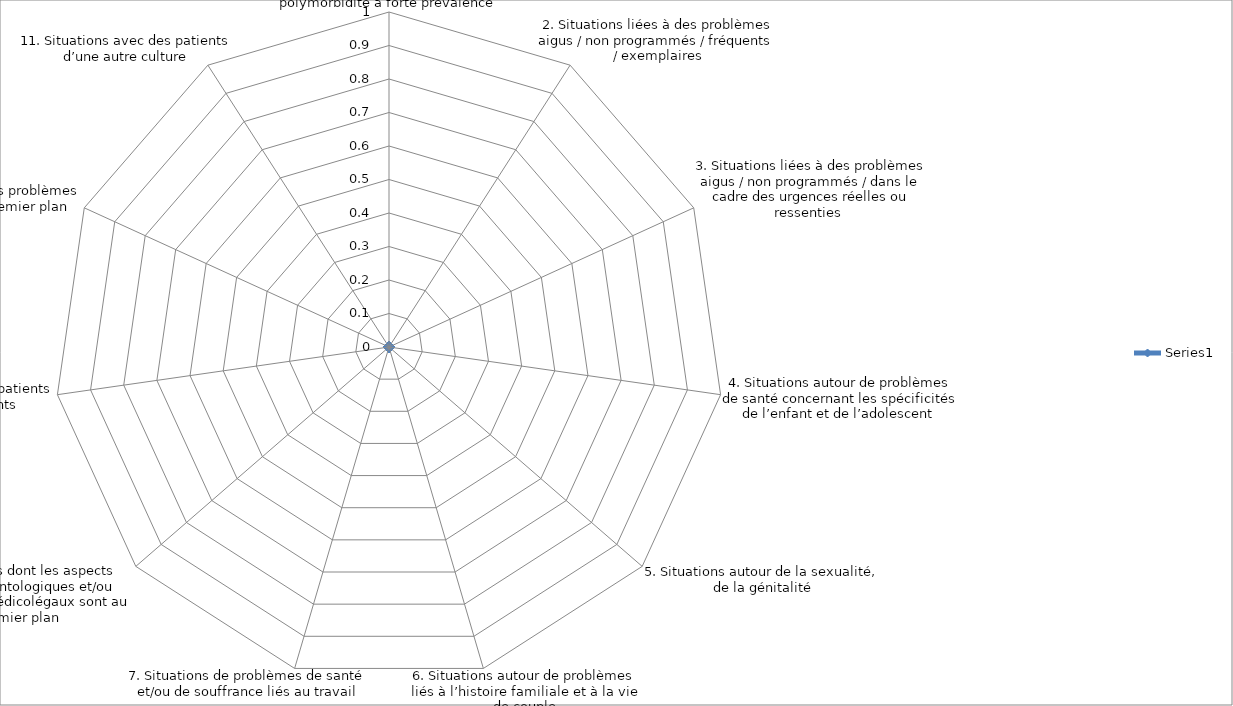
| Category | Series 0 |
|---|---|
| 1. Situations autour de patients souffrant de maladies chroniques, polymorbidité à forte prévalence | 0 |
| 2. Situations liées à des problèmes aigus / non programmés / fréquents / exemplaires | 0 |
| 3. Situations liées à des problèmes aigus / non programmés / dans le cadre des urgences réelles ou ressenties   | 0 |
| 4. Situations autour de problèmes de santé concernant les spécificités de l’enfant et de l’adolescent  | 0 |
| 5. Situations autour de la sexualité, de la génitalité | 0 |
| 6. Situations autour de problèmes liés à l’histoire familiale et à la vie de couple | 0 |
| 7. Situations de problèmes de santé et/ou de souffrance liés au travail | 0 |
| 8. Situations dont les aspects légaux, déontologiques et/ou juridiques / médicolégaux sont au premier plan  | 0 |
| 9. Situations avec des patients difficiles / exigeants  | 0 |
| 10. Situations où les problèmes sociaux sont au premier plan  | 0 |
| 11. Situations avec des patients d’une autre culture | 0 |